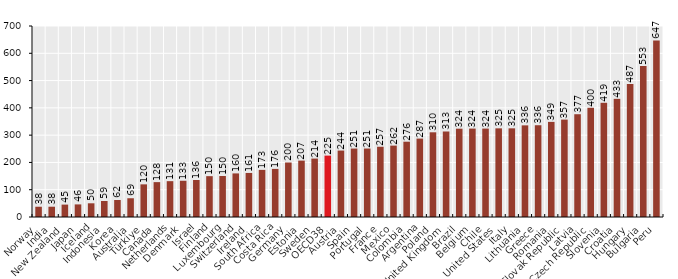
| Category | Series 0 |
|---|---|
| Norway | 37.59 |
| India | 37.704 |
| New Zealand | 45.441 |
| Japan | 46.153 |
| Iceland | 50.225 |
| Indonesia | 58.67 |
| Korea | 62.265 |
| Australia | 68.732 |
| Türkiye | 119.633 |
| Canada | 127.826 |
| Netherlands | 131.336 |
| Denmark | 132.793 |
| Israel | 135.583 |
| Finland | 149.675 |
| Luxembourg | 150.316 |
| Switzerland | 159.744 |
| Ireland | 161.435 |
| South Africa | 172.696 |
| Costa Rica | 176.272 |
| Germany | 199.774 |
| Estonia | 206.668 |
| Sweden | 214.109 |
| OECD38 | 224.999 |
| Austria | 243.531 |
| Spain | 250.892 |
| Portugal | 250.95 |
| France | 257.425 |
| Mexico | 261.653 |
| Colombia | 275.987 |
| Argentina | 287.397 |
| Poland | 310.452 |
| United Kingdom | 313.374 |
| Brazil | 323.681 |
| Belgium | 324.06 |
| Chile | 324.072 |
| United States | 324.907 |
| Italy | 324.941 |
| Lithuania | 335.851 |
| Greece | 336.321 |
| Romania | 348.572 |
| Slovak Republic | 357 |
| Latvia | 376.644 |
| Czech Republic | 400.323 |
| Slovenia | 418.56 |
| Croatia | 433.064 |
| Hungary | 487.457 |
| Bulgaria | 553.394 |
| Peru | 647.115 |